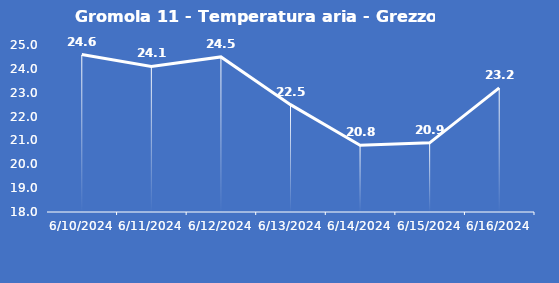
| Category | Gromola 11 - Temperatura aria - Grezzo (°C) |
|---|---|
| 6/10/24 | 24.6 |
| 6/11/24 | 24.1 |
| 6/12/24 | 24.5 |
| 6/13/24 | 22.5 |
| 6/14/24 | 20.8 |
| 6/15/24 | 20.9 |
| 6/16/24 | 23.2 |